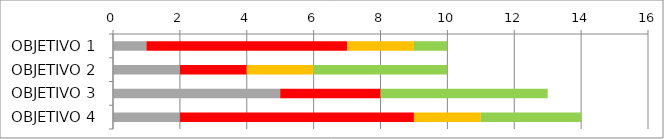
| Category | Series 1 | Series 2 | Series 3 | Series 4 | Series 5 |
|---|---|---|---|---|---|
| OBJETIVO 1 | 1 | 6 | 2 | 1 | 0 |
| OBJETIVO 2 | 2 | 2 | 2 | 4 | 0 |
| OBJETIVO 3 | 5 | 3 | 0 | 5 | 0 |
| OBJETIVO 4 | 2 | 7 | 2 | 3 | 0 |